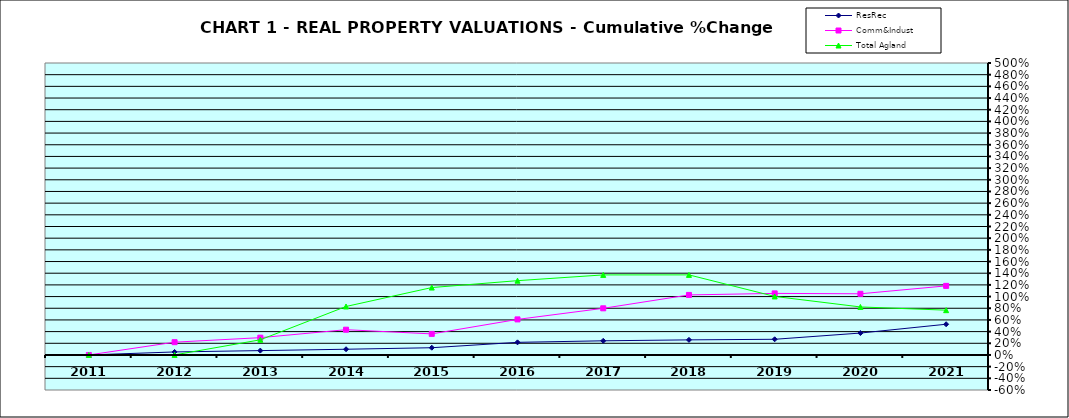
| Category | ResRec | Comm&Indust | Total Agland |
|---|---|---|---|
| 2011.0 | 0 | 0 | 0 |
| 2012.0 | 0.052 | 0.219 | 0.001 |
| 2013.0 | 0.075 | 0.296 | 0.26 |
| 2014.0 | 0.098 | 0.433 | 0.83 |
| 2015.0 | 0.124 | 0.361 | 1.154 |
| 2016.0 | 0.216 | 0.609 | 1.272 |
| 2017.0 | 0.243 | 0.799 | 1.371 |
| 2018.0 | 0.258 | 1.028 | 1.371 |
| 2019.0 | 0.268 | 1.054 | 1.003 |
| 2020.0 | 0.375 | 1.048 | 0.822 |
| 2021.0 | 0.526 | 1.183 | 0.767 |